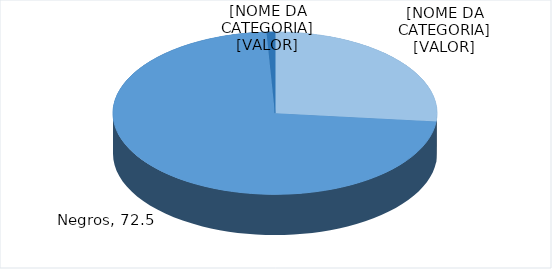
| Category | Series 0 |
|---|---|
| Branca | 26.647 |
| Negros | 72.517 |
| Outra | 0.836 |